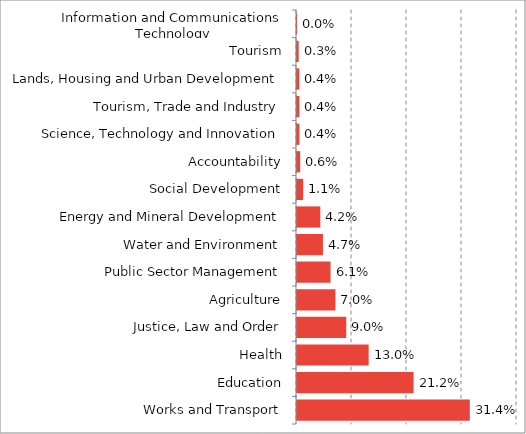
| Category | Series 0 |
|---|---|
| Works and Transport | 0.314 |
| Education | 0.212 |
| Health | 0.13 |
| Justice, Law and Order | 0.09 |
| Agriculture | 0.07 |
| Public Sector Management | 0.061 |
| Water and Environment | 0.047 |
| Energy and Mineral Development | 0.042 |
| Social Development | 0.011 |
| Accountability | 0.006 |
| Science, Technology and Innovation | 0.004 |
| Tourism, Trade and Industry | 0.004 |
| Lands, Housing and Urban Development | 0.004 |
| Tourism | 0.003 |
| Information and Communications Technology | 0 |